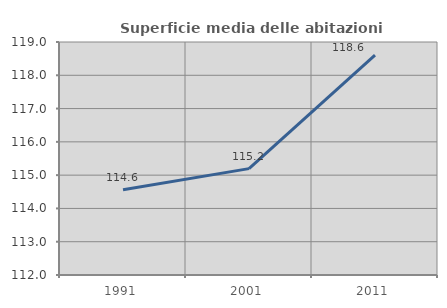
| Category | Superficie media delle abitazioni occupate |
|---|---|
| 1991.0 | 114.564 |
| 2001.0 | 115.196 |
| 2011.0 | 118.604 |